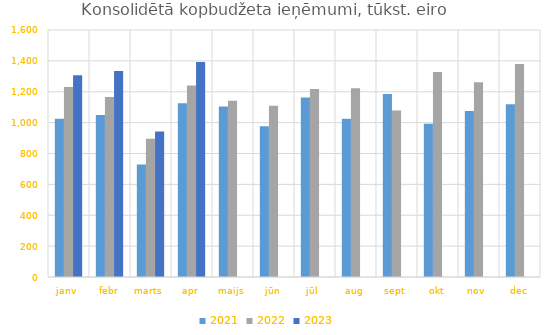
| Category | 2021 | 2022 | 2023 |
|---|---|---|---|
| janv | 1025729.219 | 1230170.047 | 1307495.685 |
| febr | 1050032.948 | 1166379.907 | 1335076.73 |
| marts | 729450.354 | 896198.796 | 941933.145 |
| apr | 1125852.842 | 1240480.294 | 1392983.428 |
| maijs | 1104155.322 | 1141583.555 | 0 |
| jūn | 976600.628 | 1110073.881 | 0 |
| jūl | 1162632.002 | 1217508.617 | 0 |
| aug | 1025720.022 | 1222030.584 | 0 |
| sept | 1184851.081 | 1079167.695 | 0 |
| okt | 993429.183 | 1328712.607 | 0 |
| nov | 1074941.099 | 1261934.438 | 0 |
| dec | 1118858.021 | 1379607.658 | 0 |